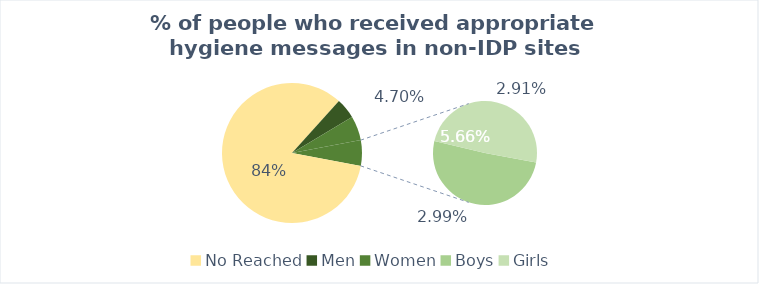
| Category | Series 0 |
|---|---|
| No Reached | 127775 |
| Men | 7173 |
| Women | 8633 |
| Boys | 4570 |
| Girls | 4441 |